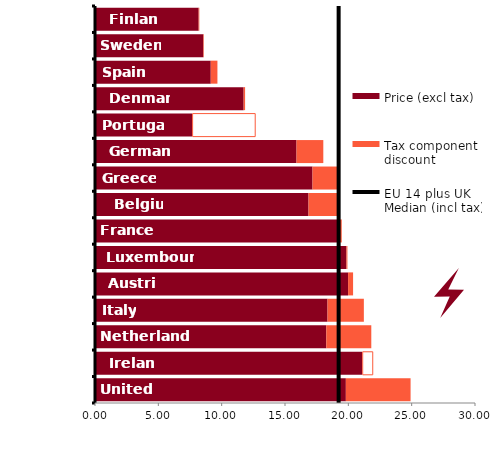
| Category | Price (excl tax) | Tax component / discount |
|---|---|---|
| United Kingdom | 19.805 | 5.11 |
| Ireland | 21.094 | 0.833 |
| Netherlands | 18.261 | 3.552 |
| Italy | 18.357 | 2.868 |
| Austria | 19.98 | 0.395 |
| Luxembourg | 19.849 | 0.079 |
| France | 19.322 | 0.158 |
| Belgium | 16.858 | 2.377 |
| Greece | 17.173 | 2.044 |
| Germany | 15.91 | 2.114 |
| Portugal | 7.666 | 4.982 |
| Denmark | 11.735 | 0.114 |
| Spain | 9.139 | 0.526 |
| Sweden | 8.552 | 0.044 |
| Finland | 8.183 | 0.053 |